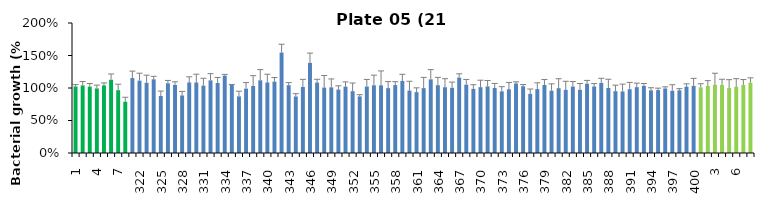
| Category | 21 h % |
|---|---|
| 1.0 | 1.023 |
| 2.0 | 1.04 |
| 3.0 | 1.021 |
| 4.0 | 0.993 |
| 5.0 | 1.04 |
| 6.0 | 1.127 |
| 7.0 | 0.967 |
| 8.0 | 0.789 |
| 321.0 | 1.152 |
| 322.0 | 1.114 |
| 323.0 | 1.08 |
| 324.0 | 1.134 |
| 325.0 | 0.877 |
| 326.0 | 1.073 |
| 327.0 | 1.048 |
| 328.0 | 0.885 |
| 329.0 | 1.086 |
| 330.0 | 1.085 |
| 331.0 | 1.037 |
| 332.0 | 1.118 |
| 333.0 | 1.077 |
| 334.0 | 1.189 |
| 335.0 | 1.049 |
| 336.0 | 0.871 |
| 337.0 | 0.99 |
| 338.0 | 1.031 |
| 339.0 | 1.118 |
| 340.0 | 1.086 |
| 341.0 | 1.098 |
| 342.0 | 1.546 |
| 343.0 | 1.043 |
| 344.0 | 0.869 |
| 345.0 | 1.015 |
| 346.0 | 1.387 |
| 347.0 | 1.084 |
| 348.0 | 1.007 |
| 349.0 | 1.01 |
| 350.0 | 0.977 |
| 351.0 | 1.022 |
| 352.0 | 0.951 |
| 353.0 | 0.871 |
| 354.0 | 1.023 |
| 355.0 | 1.042 |
| 356.0 | 1.041 |
| 357.0 | 0.998 |
| 358.0 | 1.045 |
| 359.0 | 1.109 |
| 360.0 | 0.961 |
| 361.0 | 0.937 |
| 362.0 | 0.999 |
| 363.0 | 1.133 |
| 364.0 | 1.043 |
| 365.0 | 1.012 |
| 366.0 | 1.003 |
| 367.0 | 1.16 |
| 368.0 | 1.052 |
| 369.0 | 0.987 |
| 370.0 | 1.013 |
| 371.0 | 1.025 |
| 372.0 | 1 |
| 373.0 | 0.949 |
| 374.0 | 0.981 |
| 375.0 | 1.069 |
| 376.0 | 1.027 |
| 377.0 | 0.909 |
| 378.0 | 0.984 |
| 379.0 | 1.047 |
| 380.0 | 0.959 |
| 381.0 | 0.997 |
| 382.0 | 0.971 |
| 383.0 | 1.022 |
| 384.0 | 0.973 |
| 385.0 | 1.066 |
| 386.0 | 1.024 |
| 387.0 | 1.079 |
| 388.0 | 1 |
| 389.0 | 0.952 |
| 390.0 | 0.947 |
| 391.0 | 0.981 |
| 392.0 | 1.013 |
| 393.0 | 1.033 |
| 394.0 | 0.964 |
| 395.0 | 0.968 |
| 396.0 | 0.993 |
| 397.0 | 0.958 |
| 398.0 | 0.965 |
| 399.0 | 1.022 |
| 400.0 | 1.032 |
| 1.0 | 1.009 |
| 2.0 | 1.031 |
| 3.0 | 1.049 |
| 4.0 | 1.047 |
| 5.0 | 1 |
| 6.0 | 1.019 |
| 7.0 | 1.045 |
| 8.0 | 1.082 |